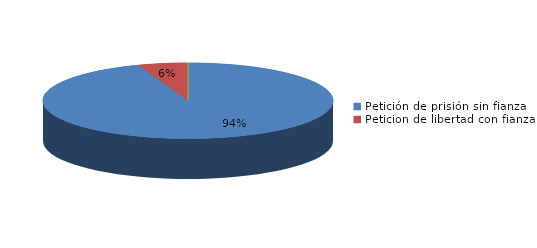
| Category | Series 0 |
|---|---|
| Petición de prisión sin fianza | 220 |
| Peticion de libertad con fianza | 13 |
| Petición de libertad | 0 |